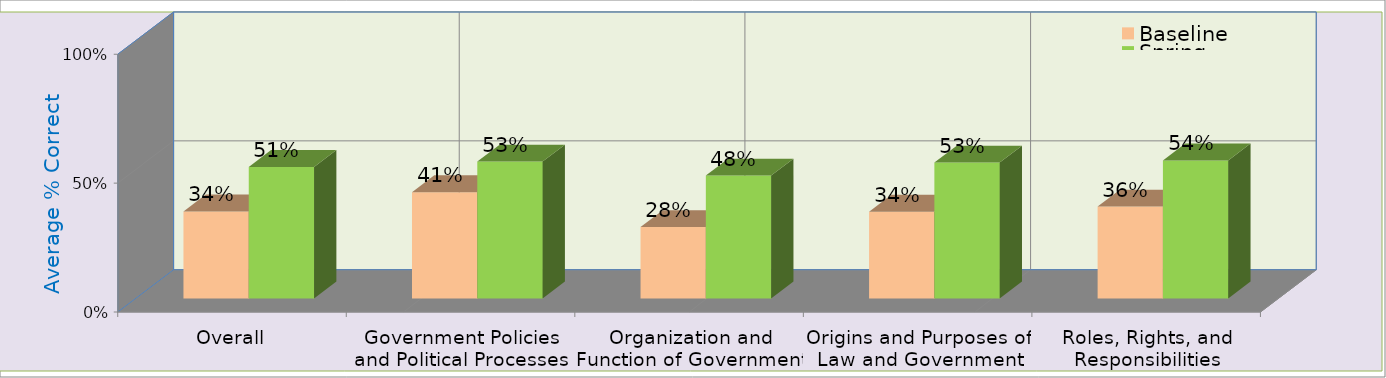
| Category | Baseline | Spring |
|---|---|---|
| Overall | 33.746 | 51.014 |
| Government Policies and Political Processes | 41.23 | 53.115 |
| Organization and Function of Government | 27.692 | 47.68 |
| Origins and Purposes of Law and Government | 33.636 | 52.713 |
| Roles, Rights, and Responsibilities | 35.635 | 53.56 |